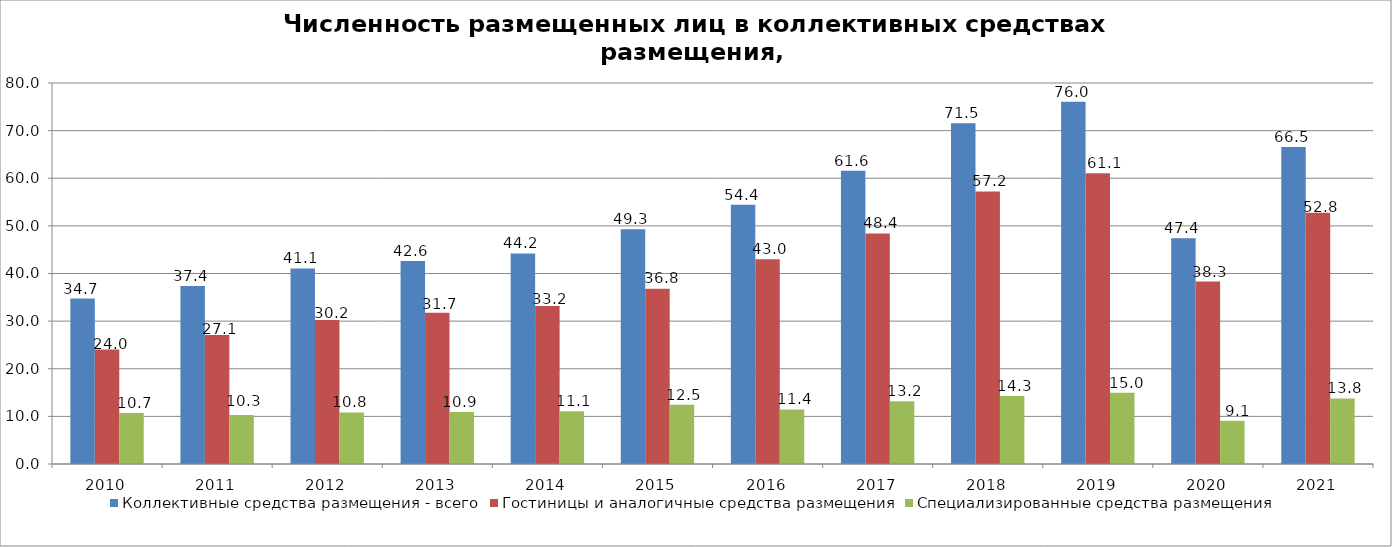
| Category | Коллективные средства размещения - всего | Гостиницы и аналогичные средства размещения | Специализированные средства размещения |
|---|---|---|---|
| 2010.0 | 34.746 | 24.026 | 10.721 |
| 2011.0 | 37.399 | 27.112 | 10.287 |
| 2012.0 | 41.065 | 30.235 | 10.83 |
| 2013.0 | 42.635 | 31.733 | 10.902 |
| 2014.0 | 44.219 | 33.16 | 11.059 |
| 2015.0 | 49.284 | 36.817 | 12.467 |
| 2016.0 | 54.431 | 42.981 | 11.45 |
| 2017.0 | 61.563 | 48.412 | 13.151 |
| 2018.0 | 71.538 | 57.243 | 14.295 |
| 2019.0 | 76.042 | 61.059 | 14.983 |
| 2020.0 | 47.382 | 38.31 | 9.073 |
| 2021.0 | 66.54 | 52.772 | 13.768 |